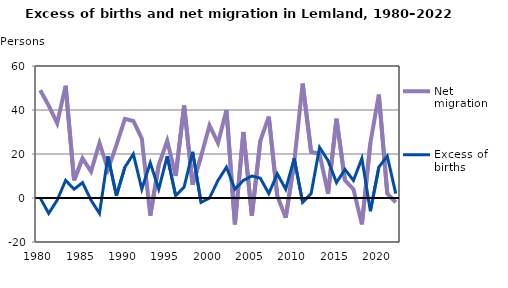
| Category | Net migration | Excess of births |
|---|---|---|
| 1980.0 | 49 | 0 |
| 1981.0 | 42 | -7 |
| 1982.0 | 34 | -1 |
| 1983.0 | 51 | 8 |
| 1984.0 | 8 | 4 |
| 1985.0 | 18 | 7 |
| 1986.0 | 12 | -1 |
| 1987.0 | 25 | -7 |
| 1988.0 | 13 | 19 |
| 1989.0 | 24 | 1 |
| 1990.0 | 36 | 14 |
| 1991.0 | 35 | 20 |
| 1992.0 | 27 | 4 |
| 1993.0 | -8 | 16 |
| 1994.0 | 15 | 4 |
| 1995.0 | 26 | 19 |
| 1996.0 | 10 | 1 |
| 1997.0 | 42 | 5 |
| 1998.0 | 6 | 21 |
| 1999.0 | 19 | -2 |
| 2000.0 | 33 | 0 |
| 2001.0 | 25 | 8 |
| 2002.0 | 40 | 14 |
| 2003.0 | -12 | 4 |
| 2004.0 | 30 | 8 |
| 2005.0 | -8 | 10 |
| 2006.0 | 26 | 9 |
| 2007.0 | 37 | 2 |
| 2008.0 | 1 | 11 |
| 2009.0 | -9 | 4 |
| 2010.0 | 16 | 18 |
| 2011.0 | 52 | -2 |
| 2012.0 | 21 | 2 |
| 2013.0 | 20 | 23 |
| 2014.0 | 2 | 17 |
| 2015.0 | 36 | 7 |
| 2016.0 | 8 | 13 |
| 2017.0 | 4 | 8 |
| 2018.0 | -12 | 18 |
| 2019.0 | 25 | -6 |
| 2020.0 | 47 | 14 |
| 2021.0 | 2 | 19 |
| 2022.0 | -2 | 2 |